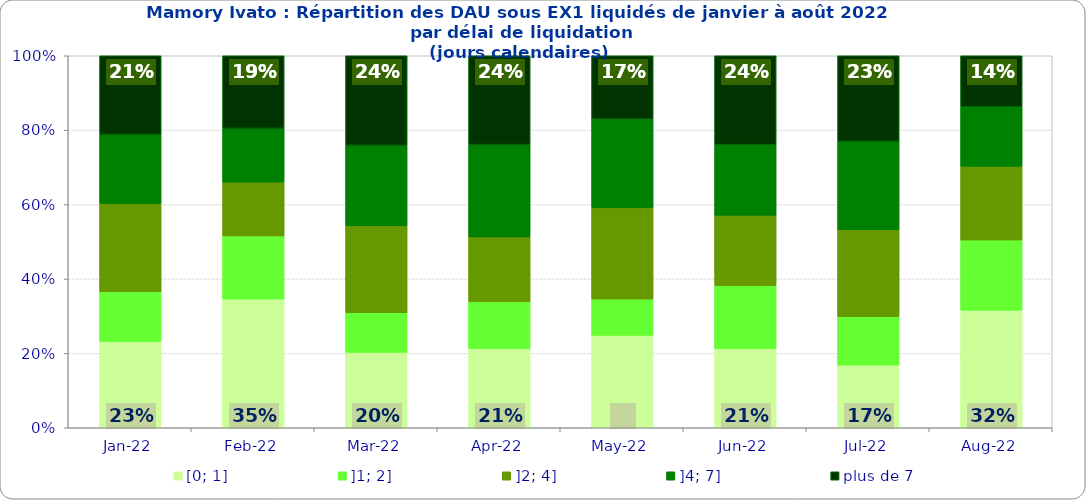
| Category | [0; 1] | ]1; 2] | ]2; 4] | ]4; 7] | plus de 7 |
|---|---|---|---|---|---|
| 2022-01-01 | 0.232 | 0.134 | 0.237 | 0.186 | 0.211 |
| 2022-02-01 | 0.346 | 0.17 | 0.145 | 0.145 | 0.195 |
| 2022-03-01 | 0.203 | 0.107 | 0.234 | 0.216 | 0.241 |
| 2022-04-01 | 0.213 | 0.126 | 0.174 | 0.248 | 0.239 |
| 2022-05-01 | 0.248 | 0.097 | 0.245 | 0.239 | 0.17 |
| 2022-06-01 | 0.213 | 0.169 | 0.189 | 0.189 | 0.239 |
| 2022-07-01 | 0.169 | 0.13 | 0.234 | 0.238 | 0.23 |
| 2022-08-01 | 0.316 | 0.189 | 0.198 | 0.16 | 0.137 |